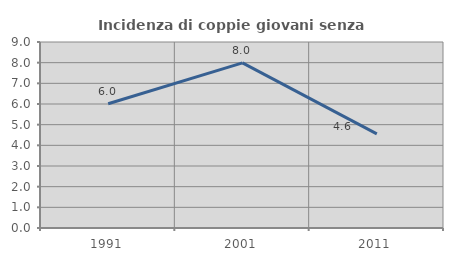
| Category | Incidenza di coppie giovani senza figli |
|---|---|
| 1991.0 | 6.01 |
| 2001.0 | 7.99 |
| 2011.0 | 4.553 |